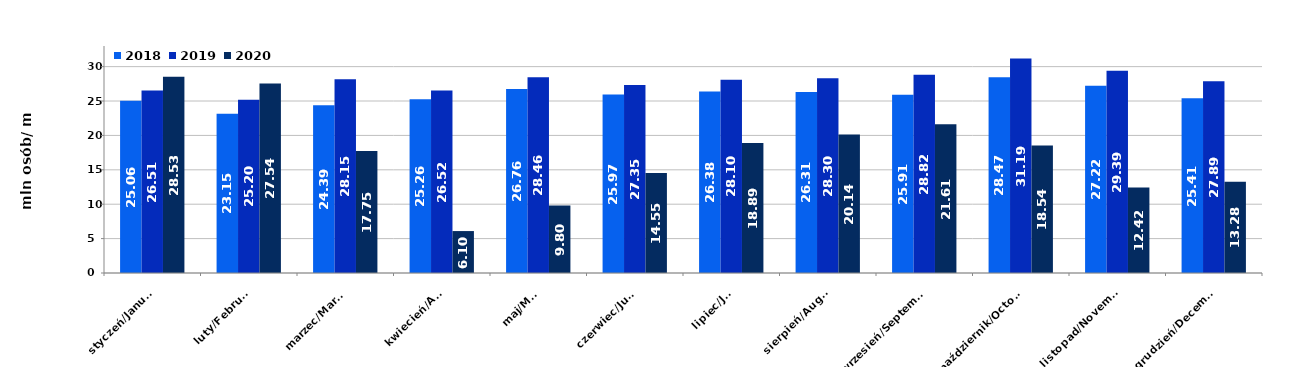
| Category | 2018 | 2019 | 2020 |
|---|---|---|---|
| styczeń/January | 25.058 | 26.513 | 28.532 |
| luty/February | 23.152 | 25.203 | 27.536 |
| marzec/March | 24.39 | 28.151 | 17.75 |
| kwiecień/April | 25.259 | 26.524 | 6.097 |
| maj/May | 26.758 | 28.461 | 9.803 |
| czerwiec/June | 25.967 | 27.347 | 14.547 |
| lipiec/July | 26.377 | 28.1 | 18.892 |
| sierpień/August | 26.314 | 28.303 | 20.142 |
| wrzesień/September | 25.911 | 28.825 | 21.608 |
| październik/October | 28.471 | 31.194 | 18.541 |
| listopad/November | 27.215 | 29.386 | 12.423 |
| grudzień/December | 25.411 | 27.893 | 13.281 |